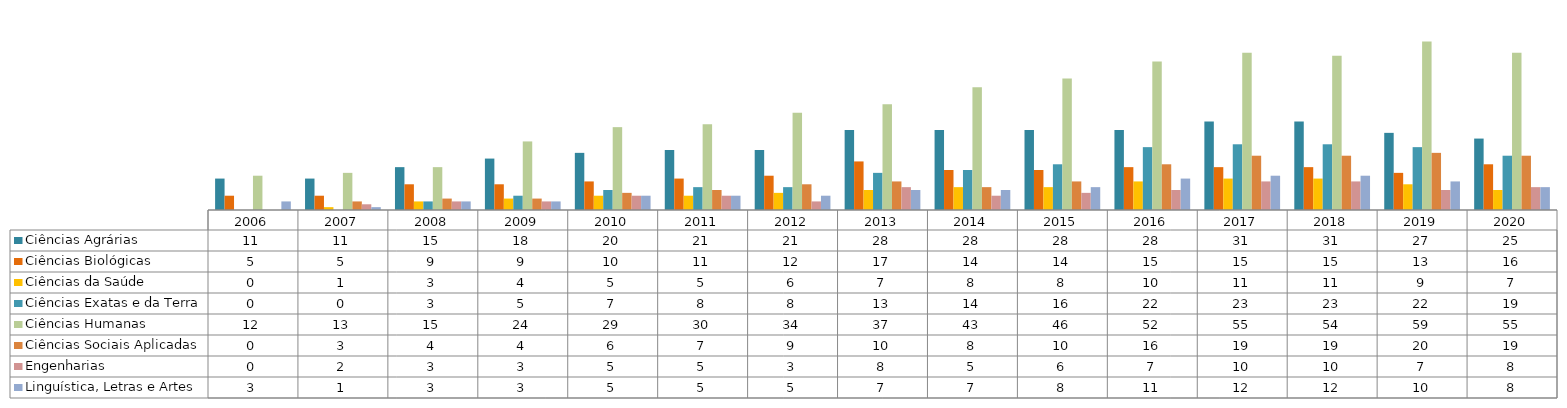
| Category | Ciências Agrárias  | Ciências Biológicas  | Ciências da Saúde  | Ciências Exatas e da Terra  | Ciências Humanas  | Ciências Sociais Aplicadas  | Engenharias  | Linguística, Letras e Artes  |
|---|---|---|---|---|---|---|---|---|
| 2006.0 | 11 | 5 | 0 | 0 | 12 | 0 | 0 | 3 |
| 2007.0 | 11 | 5 | 1 | 0 | 13 | 3 | 2 | 1 |
| 2008.0 | 15 | 9 | 3 | 3 | 15 | 4 | 3 | 3 |
| 2009.0 | 18 | 9 | 4 | 5 | 24 | 4 | 3 | 3 |
| 2010.0 | 20 | 10 | 5 | 7 | 29 | 6 | 5 | 5 |
| 2011.0 | 21 | 11 | 5 | 8 | 30 | 7 | 5 | 5 |
| 2012.0 | 21 | 12 | 6 | 8 | 34 | 9 | 3 | 5 |
| 2013.0 | 28 | 17 | 7 | 13 | 37 | 10 | 8 | 7 |
| 2014.0 | 28 | 14 | 8 | 14 | 43 | 8 | 5 | 7 |
| 2015.0 | 28 | 14 | 8 | 16 | 46 | 10 | 6 | 8 |
| 2016.0 | 28 | 15 | 10 | 22 | 52 | 16 | 7 | 11 |
| 2017.0 | 31 | 15 | 11 | 23 | 55 | 19 | 10 | 12 |
| 2018.0 | 31 | 15 | 11 | 23 | 54 | 19 | 10 | 12 |
| 2019.0 | 27 | 13 | 9 | 22 | 59 | 20 | 7 | 10 |
| 2020.0 | 25 | 16 | 7 | 19 | 55 | 19 | 8 | 8 |